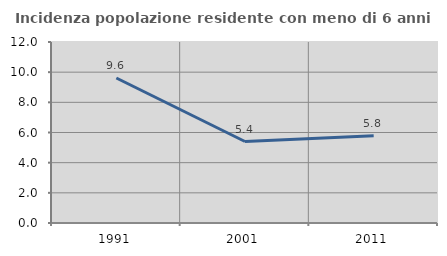
| Category | Incidenza popolazione residente con meno di 6 anni |
|---|---|
| 1991.0 | 9.613 |
| 2001.0 | 5.403 |
| 2011.0 | 5.783 |